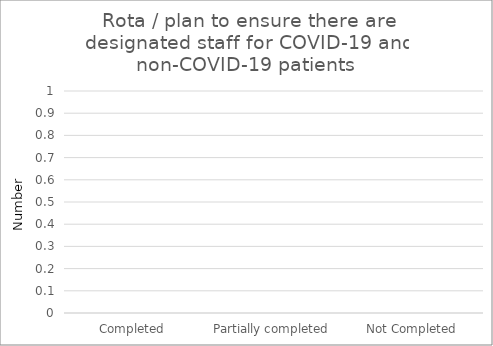
| Category | Rota / plan to ensure there are designated staff for COVID-19 and non-COVID-19 patients  |
|---|---|
| Completed | 0 |
| Partially completed | 0 |
| Not Completed | 0 |